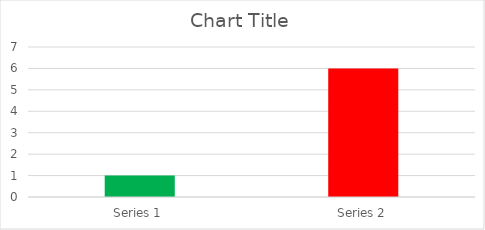
| Category | Series 0 |
|---|---|
| Series 1 | 1 |
| Series 2 | 6 |